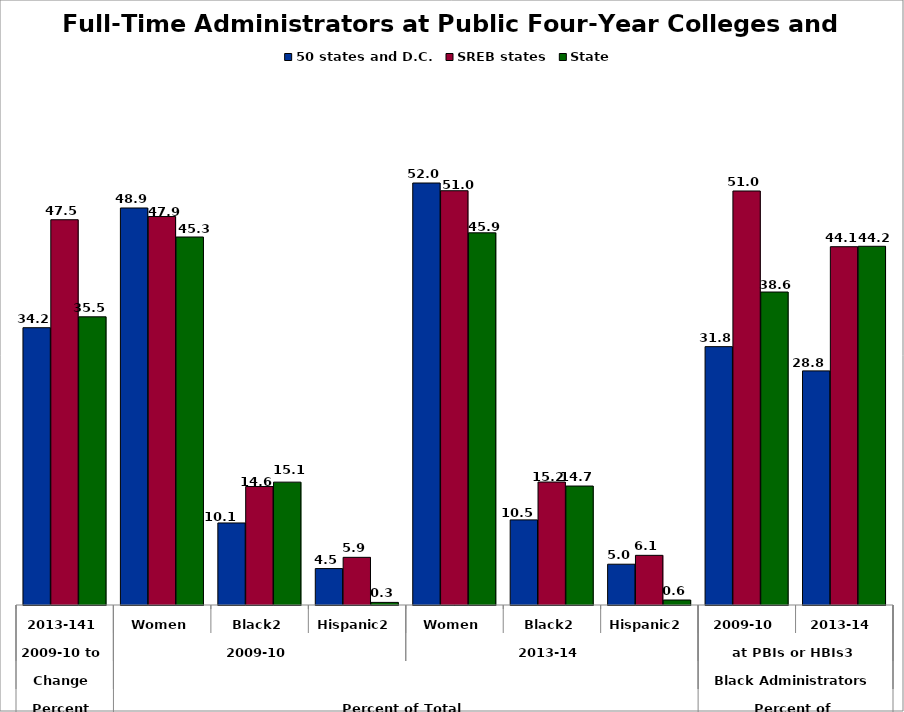
| Category | 50 states and D.C. | SREB states | State |
|---|---|---|---|
| 0 | 34.163 | 47.467 | 35.504 |
| 1 | 48.912 | 47.859 | 45.338 |
| 2 | 10.107 | 14.594 | 15.138 |
| 3 | 4.485 | 5.872 | 0.321 |
| 4 | 51.991 | 51.038 | 45.853 |
| 5 | 10.487 | 15.151 | 14.657 |
| 6 | 5.025 | 6.119 | 0.615 |
| 7 | 31.829 | 51.007 | 38.559 |
| 8 | 28.844 | 44.143 | 44.194 |